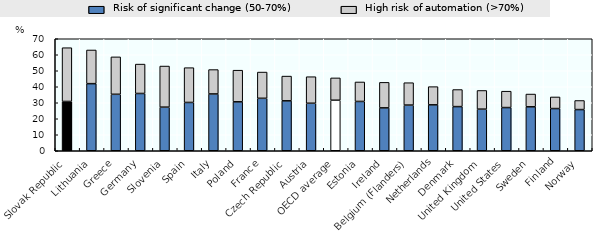
| Category | Risk of significant change (50-70%) | High risk of automation (>70%) |
|---|---|---|
| Slovak Republic | 30.809 | 33.604 |
| Lithuania | 41.935 | 21.05 |
| Greece | 35.293 | 23.388 |
| Germany | 35.794 | 18.367 |
| Slovenia | 27.249 | 25.7 |
| Spain | 30.191 | 21.736 |
| Italy | 35.506 | 15.234 |
| Poland | 30.577 | 19.775 |
| France | 32.781 | 16.404 |
| Czech Republic | 31.199 | 15.464 |
| Austria | 29.678 | 16.605 |
| OECD average | 31.572 | 13.957 |
| Estonia | 30.817 | 12.18 |
| Ireland | 26.804 | 15.944 |
| Belgium (Flanders) | 28.544 | 13.988 |
| Netherlands | 28.701 | 11.37 |
| Denmark | 27.598 | 10.658 |
| United Kingdom | 25.999 | 11.683 |
| United States | 26.998 | 10.232 |
| Sweden | 27.469 | 7.975 |
| Finland | 26.374 | 7.249 |
| Norway | 25.74 | 5.669 |